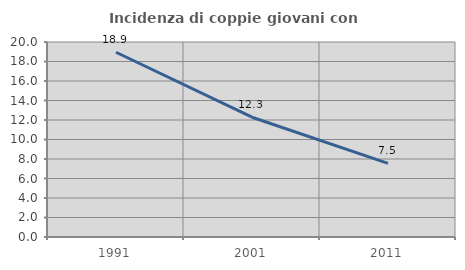
| Category | Incidenza di coppie giovani con figli |
|---|---|
| 1991.0 | 18.947 |
| 2001.0 | 12.286 |
| 2011.0 | 7.549 |